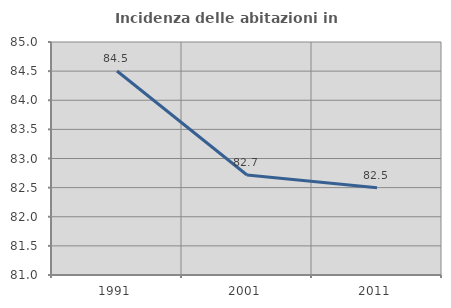
| Category | Incidenza delle abitazioni in proprietà  |
|---|---|
| 1991.0 | 84.503 |
| 2001.0 | 82.716 |
| 2011.0 | 82.499 |